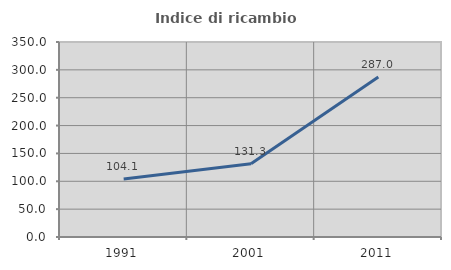
| Category | Indice di ricambio occupazionale  |
|---|---|
| 1991.0 | 104.122 |
| 2001.0 | 131.315 |
| 2011.0 | 287.007 |